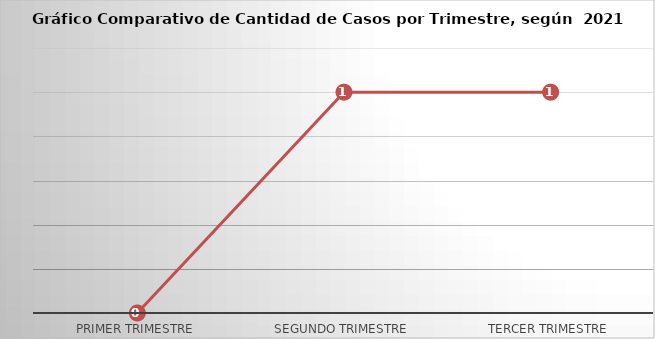
| Category | Series 0 |
|---|---|
| Primer Trimestre | 0 |
| Segundo Trimestre | 1 |
| Tercer Trimestre | 1 |